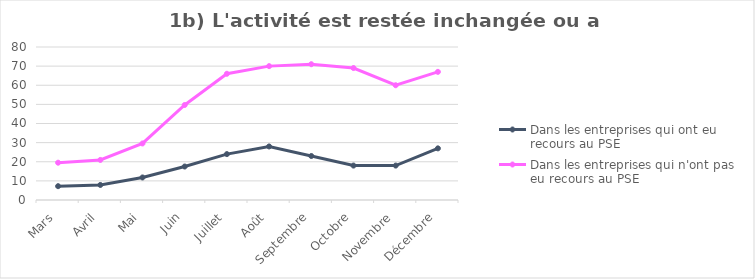
| Category | Dans les entreprises qui ont eu recours au PSE  | Dans les entreprises qui n'ont pas eu recours au PSE  |
|---|---|---|
| Mars | 7.226 | 19.509 |
| Avril | 7.865 | 20.946 |
| Mai | 11.787 | 29.569 |
| Juin | 17.507 | 49.672 |
| Juillet | 24 | 66 |
| Août | 28 | 70 |
| Septembre | 23 | 71 |
| Octobre | 18 | 69 |
| Novembre | 18 | 60 |
| Décembre | 27 | 67 |